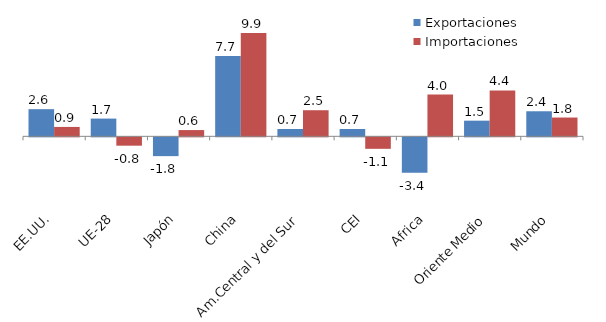
| Category | Exportaciones | Importaciones |
|---|---|---|
| EE.UU. | 2.6 | 0.9 |
| UE-28 | 1.7 | -0.8 |
| Japón | -1.8 | 0.6 |
| China | 7.7 | 9.9 |
| Am.Central y del Sur | 0.7 | 2.5 |
| CEI | 0.7 | -1.1 |
| Africa | -3.4 | 4 |
| Oriente Medio | 1.5 | 4.4 |
| Mundo | 2.4 | 1.8 |